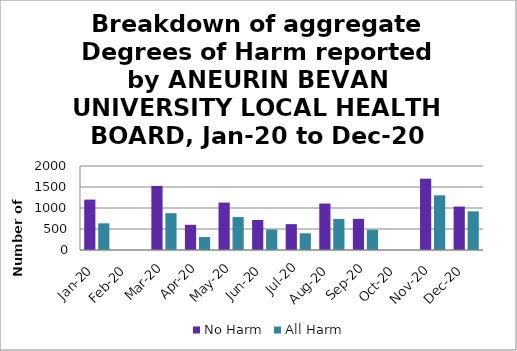
| Category | No Harm | All Harm |
|---|---|---|
| Jan-20 | 1200 | 635 |
| Feb-20 | 0 | 0 |
| Mar-20 | 1525 | 877 |
| Apr-20 | 600 | 308 |
| May-20 | 1129 | 784 |
| Jun-20 | 715 | 487 |
| Jul-20 | 616 | 398 |
| Aug-20 | 1106 | 740 |
| Sep-20 | 742 | 482 |
| Oct-20 | 0 | 0 |
| Nov-20 | 1699 | 1302 |
| Dec-20 | 1034 | 921 |